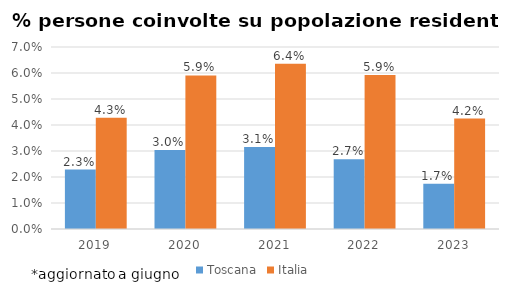
| Category | Toscana | Italia |
|---|---|---|
| 2019.0 | 0.023 | 0.043 |
| 2020.0 | 0.03 | 0.059 |
| 2021.0 | 0.031 | 0.064 |
| 2022.0 | 0.027 | 0.059 |
| 2023.0 | 0.017 | 0.042 |